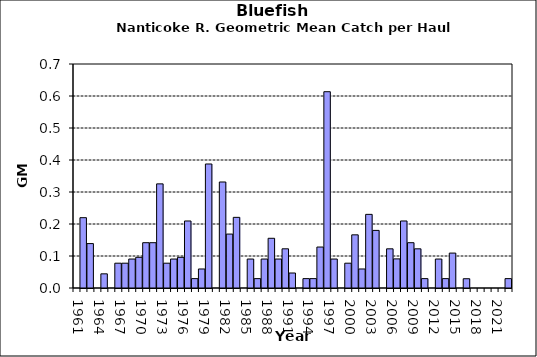
| Category | Series 0 |
|---|---|
| 1961.0 | 0 |
| 1962.0 | 0.22 |
| 1963.0 | 0.139 |
| 1964.0 | 0 |
| 1965.0 | 0.044 |
| 1966.0 | 0 |
| 1967.0 | 0.078 |
| 1968.0 | 0.078 |
| 1969.0 | 0.091 |
| 1970.0 | 0.096 |
| 1971.0 | 0.142 |
| 1972.0 | 0.142 |
| 1973.0 | 0.325 |
| 1974.0 | 0.078 |
| 1975.0 | 0.091 |
| 1976.0 | 0.096 |
| 1977.0 | 0.209 |
| 1978.0 | 0.029 |
| 1979.0 | 0.059 |
| 1980.0 | 0.388 |
| 1981.0 | 0 |
| 1982.0 | 0.331 |
| 1983.0 | 0.169 |
| 1984.0 | 0.221 |
| 1985.0 | 0 |
| 1986.0 | 0.091 |
| 1987.0 | 0.029 |
| 1988.0 | 0.091 |
| 1989.0 | 0.155 |
| 1990.0 | 0.091 |
| 1991.0 | 0.122 |
| 1992.0 | 0.047 |
| 1993.0 | 0 |
| 1994.0 | 0.029 |
| 1995.0 | 0.029 |
| 1996.0 | 0.128 |
| 1997.0 | 0.613 |
| 1998.0 | 0.091 |
| 1999.0 | 0 |
| 2000.0 | 0.078 |
| 2001.0 | 0.166 |
| 2002.0 | 0.059 |
| 2003.0 | 0.23 |
| 2004.0 | 0.18 |
| 2005.0 | 0 |
| 2006.0 | 0.122 |
| 2007.0 | 0.091 |
| 2008.0 | 0.209 |
| 2009.0 | 0.142 |
| 2010.0 | 0.122 |
| 2011.0 | 0.029 |
| 2012.0 | 0 |
| 2013.0 | 0.091 |
| 2014.0 | 0.029 |
| 2015.0 | 0.109 |
| 2016.0 | 0 |
| 2017.0 | 0.029 |
| 2018.0 | 0 |
| 2019.0 | 0 |
| 2020.0 | 0 |
| 2021.0 | 0 |
| 2022.0 | 0 |
| 2023.0 | 0.029 |